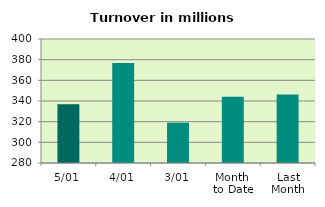
| Category | Series 0 |
|---|---|
| 5/01 | 336.801 |
| 4/01 | 376.847 |
| 3/01 | 318.999 |
| Month 
to Date | 344.216 |
| Last
Month | 346.191 |